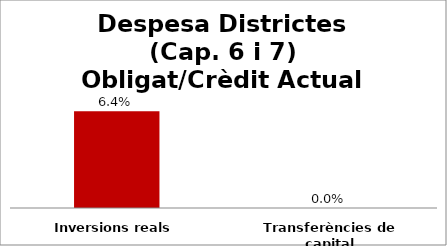
| Category | Series 0 |
|---|---|
| Inversions reals | 0.064 |
| Transferències de capital | 0 |